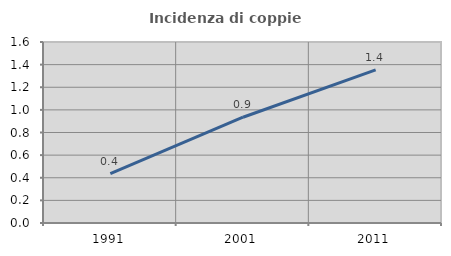
| Category | Incidenza di coppie miste |
|---|---|
| 1991.0 | 0.436 |
| 2001.0 | 0.935 |
| 2011.0 | 1.354 |